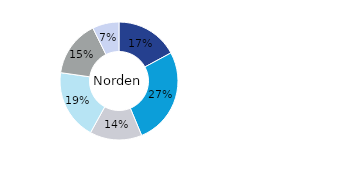
| Category | Norden |
|---|---|
| Kontor | 0.171 |
| Bostäder | 0.266 |
| Handel | 0.143 |
| Logistik* | 0.192 |
| Samhällsfastigheter** | 0.154 |
| Övrigt | 0.073 |